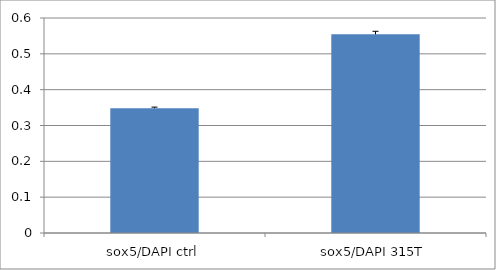
| Category | Series 0 |
|---|---|
| sox5/DAPI ctrl | 0.348 |
| sox5/DAPI 315T | 0.554 |